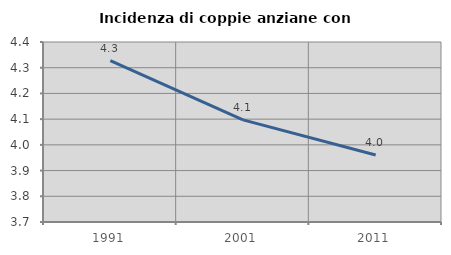
| Category | Incidenza di coppie anziane con figli |
|---|---|
| 1991.0 | 4.328 |
| 2001.0 | 4.097 |
| 2011.0 | 3.96 |